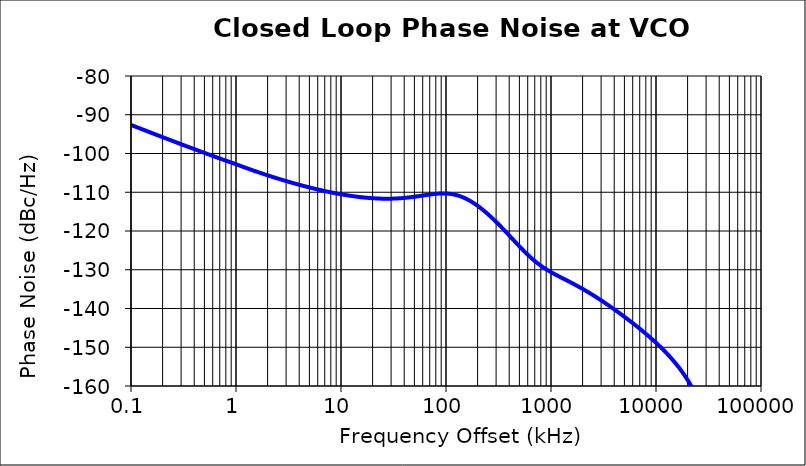
| Category | Series 2 |
|---|---|
| 0.1 | -92.631 |
| 0.1122018454301966 | -93.159 |
| 0.12589254117941703 | -93.686 |
| 0.14125375446227575 | -94.211 |
| 0.15848931924611176 | -94.734 |
| 0.17782794100389276 | -95.255 |
| 0.19952623149688853 | -95.774 |
| 0.22387211385683461 | -96.291 |
| 0.2511886431509588 | -96.806 |
| 0.28183829312644626 | -97.319 |
| 0.316227766016839 | -97.83 |
| 0.3548133892335767 | -98.338 |
| 0.39810717055349865 | -98.843 |
| 0.44668359215096465 | -99.346 |
| 0.501187233627274 | -99.846 |
| 0.5623413251903512 | -100.342 |
| 0.6309573444801956 | -100.836 |
| 0.7079457843841407 | -101.325 |
| 0.7943282347242847 | -101.811 |
| 0.8912509381337492 | -102.292 |
| 1.0 | -102.769 |
| 1.122018454301966 | -103.274 |
| 1.2589254117941702 | -103.767 |
| 1.4125375446227577 | -104.247 |
| 1.5848931924611176 | -104.716 |
| 1.7782794100389276 | -105.174 |
| 1.9952623149688853 | -105.621 |
| 2.2387211385683456 | -106.056 |
| 2.5118864315095877 | -106.48 |
| 2.818382931264463 | -106.893 |
| 3.1622776601683897 | -107.294 |
| 3.548133892335767 | -107.682 |
| 3.9810717055349865 | -108.057 |
| 4.466835921509647 | -108.42 |
| 5.011872336272741 | -108.768 |
| 5.623413251903512 | -109.101 |
| 6.309573444801956 | -109.419 |
| 7.079457843841406 | -109.721 |
| 7.943282347242847 | -110.006 |
| 8.912509381337491 | -110.274 |
| 10.0 | -110.522 |
| 11.22018454301966 | -110.749 |
| 12.589254117941703 | -110.955 |
| 14.125375446227576 | -111.139 |
| 15.848931924611176 | -111.299 |
| 17.782794100389278 | -111.433 |
| 19.952623149688854 | -111.539 |
| 22.387211385683457 | -111.615 |
| 25.118864315095877 | -111.658 |
| 28.183829312644626 | -111.667 |
| 31.6227766016839 | -111.639 |
| 35.48133892335767 | -111.573 |
| 39.81071705534986 | -111.469 |
| 44.668359215096466 | -111.329 |
| 50.1187233627274 | -111.158 |
| 56.23413251903512 | -110.964 |
| 63.09573444801956 | -110.761 |
| 70.79457843841408 | -110.569 |
| 79.43282347242847 | -110.411 |
| 89.12509381337492 | -110.317 |
| 100.0 | -110.321 |
| 112.20184543019658 | -110.452 |
| 125.89254117941702 | -110.734 |
| 141.25375446227577 | -111.181 |
| 158.48931924611176 | -111.796 |
| 177.82794100389276 | -112.569 |
| 199.52623149688853 | -113.486 |
| 223.8721138568346 | -114.53 |
| 251.1886431509588 | -115.684 |
| 281.8382931264463 | -116.934 |
| 316.2277660168389 | -118.263 |
| 354.8133892335767 | -119.656 |
| 398.1071705534987 | -121.092 |
| 446.68359215096467 | -122.547 |
| 501.18723362727405 | -123.989 |
| 562.3413251903512 | -125.379 |
| 630.9573444801955 | -126.679 |
| 707.9457843841408 | -127.858 |
| 794.3282347242847 | -128.901 |
| 891.2509381337492 | -129.814 |
| 1000.0 | -130.621 |
| 1122.018454301966 | -131.356 |
| 1258.9254117941703 | -132.054 |
| 1412.5375446227577 | -132.743 |
| 1584.8931924611177 | -133.444 |
| 1778.2794100389276 | -134.171 |
| 1995.2623149688852 | -134.929 |
| 2238.721138568346 | -135.723 |
| 2511.886431509588 | -136.551 |
| 2818.382931264463 | -137.413 |
| 3162.277660168389 | -138.306 |
| 3548.133892335767 | -139.228 |
| 3981.071705534987 | -140.178 |
| 4466.835921509647 | -141.153 |
| 5011.8723362727405 | -142.154 |
| 5623.413251903512 | -143.182 |
| 6309.573444801955 | -144.239 |
| 7079.457843841408 | -145.327 |
| 7943.282347242847 | -146.453 |
| 8912.509381337492 | -147.623 |
| 10000.0 | -148.847 |
| 11220.1845430197 | -150.137 |
| 12589.2541179417 | -151.511 |
| 14125.3754462276 | -152.992 |
| 15848.9319246112 | -154.608 |
| 17782.7941003893 | -156.398 |
| 19952.6231496889 | -158.416 |
| 22387.2113856835 | -160.731 |
| 25118.8643150959 | -163.443 |
| 28183.8293126446 | -166.682 |
| 31622.7766016839 | -170.609 |
| 35481.3389233577 | -175.296 |
| 39810.7170553499 | -180.056 |
| 44668.3592150965 | -182.832 |
| 50118.7233627274 | -183.971 |
| 56234.1325190351 | -184.873 |
| 63095.7344480195 | -185.186 |
| 70794.5784384141 | -185.584 |
| 79432.8234724285 | -187.061 |
| 89125.0938133749 | -188.858 |
| 100000.0 | -189.977 |